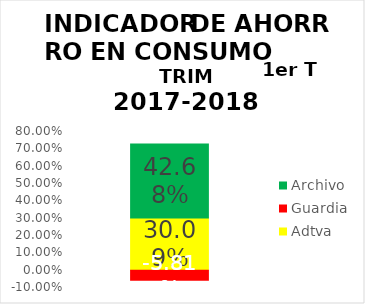
| Category | Adtva | Guardia | Archivo |
|---|---|---|---|
| 0 | 0.301 | -0.058 | 0.427 |